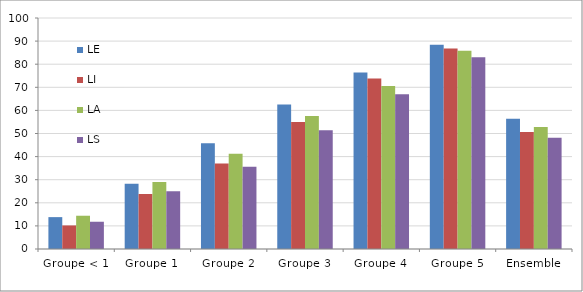
| Category | LE | LI | LA | LS |
|---|---|---|---|---|
| Groupe < 1 | 13.8 | 10.2 | 14.4 | 11.8 |
| Groupe 1 | 28.2 | 23.8 | 29 | 25 |
| Groupe 2 | 45.8 | 37 | 41.2 | 35.6 |
| Groupe 3 | 62.6 | 55 | 57.6 | 51.4 |
| Groupe 4 | 76.4 | 73.8 | 70.6 | 67 |
| Groupe 5 | 88.4 | 86.8 | 85.8 | 83 |
| Ensemble | 56.4 | 50.6 | 52.8 | 48.2 |